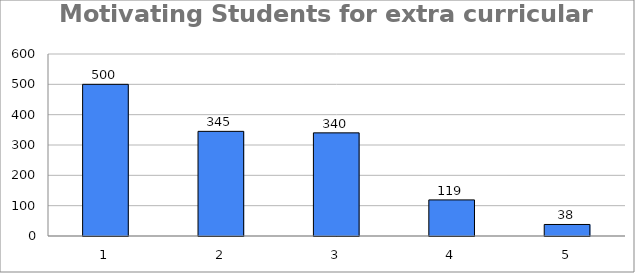
| Category | Series 0 |
|---|---|
| 0 | 500 |
| 1 | 345 |
| 2 | 340 |
| 3 | 119 |
| 4 | 38 |